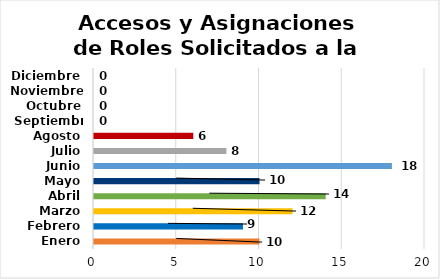
| Category | Accesos y Asignaciones de Roles Solicitados a la DAFI |
|---|---|
| Enero | 10 |
| Febrero | 9 |
| Marzo | 12 |
| Abril | 14 |
| Mayo | 10 |
| Junio | 18 |
| Julio | 8 |
| Agosto | 6 |
| Septiembre | 0 |
| Octubre | 0 |
| Noviembre | 0 |
| Diciembre | 0 |